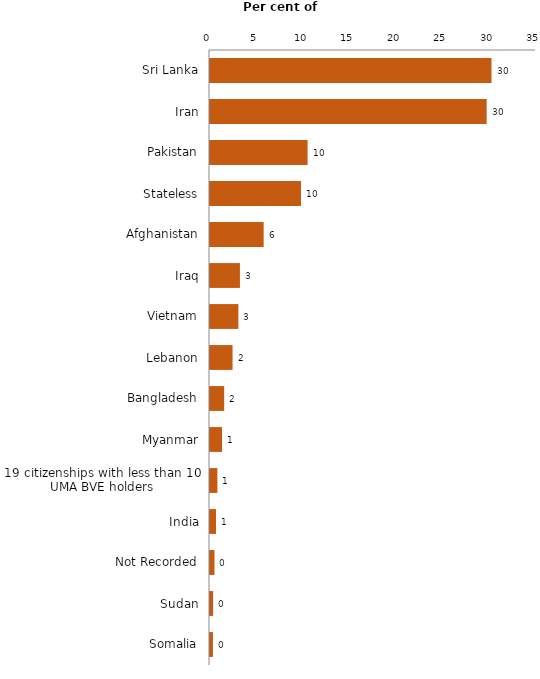
| Category | Citzenship |
|---|---|
| Sri Lanka | 30.223 |
| Iran | 29.702 |
| Pakistan | 10.478 |
| Stateless | 9.768 |
| Afghanistan | 5.761 |
| Iraq | 3.214 |
| Vietnam | 3.047 |
| Lebanon | 2.421 |
| Bangladesh | 1.524 |
| Myanmar | 1.294 |
| 19 citizenships with less than 10 UMA BVE holders | 0.793 |
| India | 0.647 |
| Not Recorded | 0.48 |
| Sudan | 0.334 |
| Somalia | 0.313 |